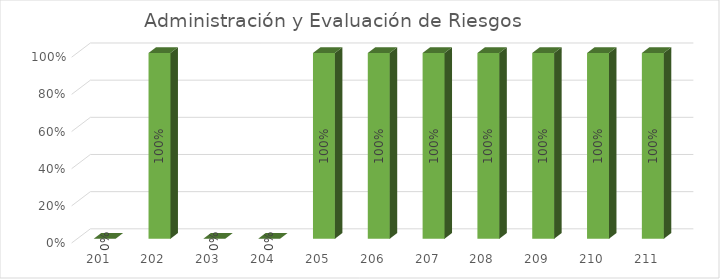
| Category | % Avance |
|---|---|
| 201.0 | 0 |
| 202.0 | 1 |
| 203.0 | 0 |
| 204.0 | 0 |
| 205.0 | 1 |
| 206.0 | 1 |
| 207.0 | 1 |
| 208.0 | 1 |
| 209.0 | 1 |
| 210.0 | 1 |
| 211.0 | 1 |